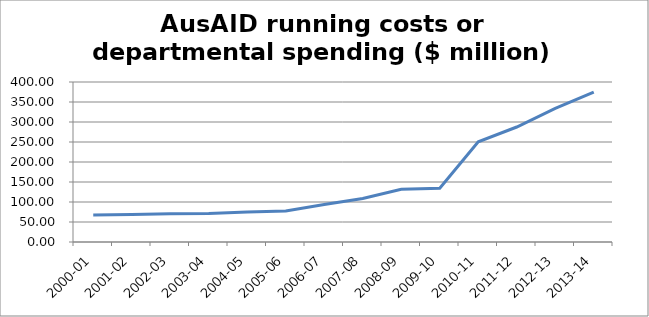
| Category | AusAID Departmental |
|---|---|
| 2000-01 | 67.6 |
| 2001-02 | 68.7 |
| 2002-03 | 70.6 |
| 2003-04 | 71.2 |
| 2004-05 | 75.1 |
| 2005-06 | 77.8 |
| 2006-07 | 93.5 |
| 2007-08 | 108.8 |
| 2008-09 | 132 |
| 2009-10 | 134.3 |
| 2010-11 | 250.3 |
| 2011-12 | 287.5 |
| 2012-13 | 333.8 |
| 2013-14 | 374.9 |